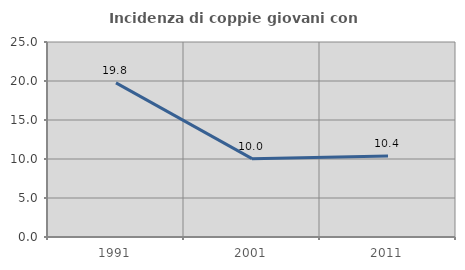
| Category | Incidenza di coppie giovani con figli |
|---|---|
| 1991.0 | 19.761 |
| 2001.0 | 10.047 |
| 2011.0 | 10.377 |